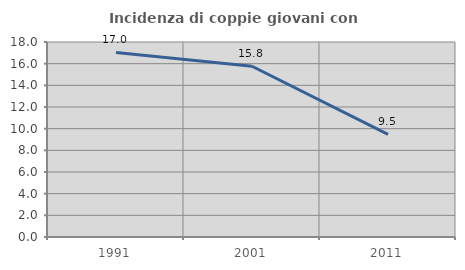
| Category | Incidenza di coppie giovani con figli |
|---|---|
| 1991.0 | 17.031 |
| 2001.0 | 15.762 |
| 2011.0 | 9.471 |